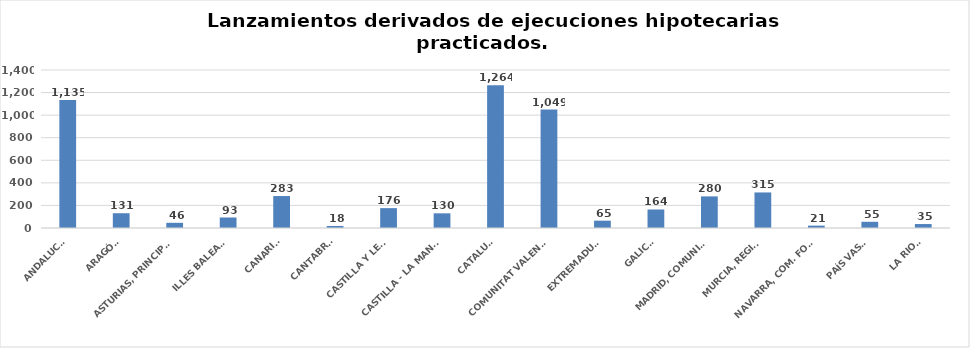
| Category | Series 0 |
|---|---|
| ANDALUCÍA | 1135 |
| ARAGÓN | 131 |
| ASTURIAS, PRINCIPADO | 46 |
| ILLES BALEARS | 93 |
| CANARIAS | 283 |
| CANTABRIA | 18 |
| CASTILLA Y LEÓN | 176 |
| CASTILLA - LA MANCHA | 130 |
| CATALUÑA | 1264 |
| COMUNITAT VALENCIANA | 1049 |
| EXTREMADURA | 65 |
| GALICIA | 164 |
| MADRID, COMUNIDAD | 280 |
| MURCIA, REGIÓN | 315 |
| NAVARRA, COM. FORAL | 21 |
| PAÍS VASCO | 55 |
| LA RIOJA | 35 |